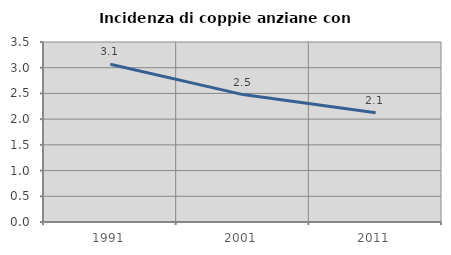
| Category | Incidenza di coppie anziane con figli |
|---|---|
| 1991.0 | 3.067 |
| 2001.0 | 2.477 |
| 2011.0 | 2.126 |